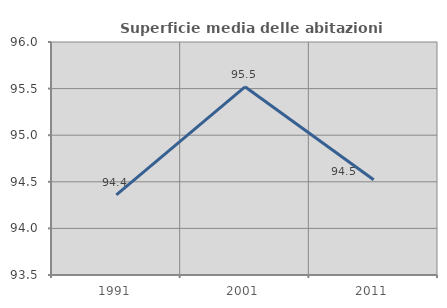
| Category | Superficie media delle abitazioni occupate |
|---|---|
| 1991.0 | 94.36 |
| 2001.0 | 95.519 |
| 2011.0 | 94.521 |